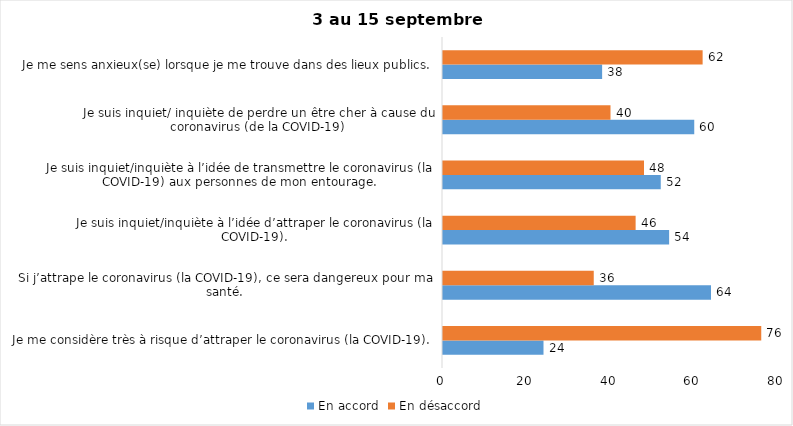
| Category | En accord | En désaccord |
|---|---|---|
| Je me considère très à risque d’attraper le coronavirus (la COVID-19). | 24 | 76 |
| Si j’attrape le coronavirus (la COVID-19), ce sera dangereux pour ma santé. | 64 | 36 |
| Je suis inquiet/inquiète à l’idée d’attraper le coronavirus (la COVID-19). | 54 | 46 |
| Je suis inquiet/inquiète à l’idée de transmettre le coronavirus (la COVID-19) aux personnes de mon entourage. | 52 | 48 |
| Je suis inquiet/ inquiète de perdre un être cher à cause du coronavirus (de la COVID-19) | 60 | 40 |
| Je me sens anxieux(se) lorsque je me trouve dans des lieux publics. | 38 | 62 |